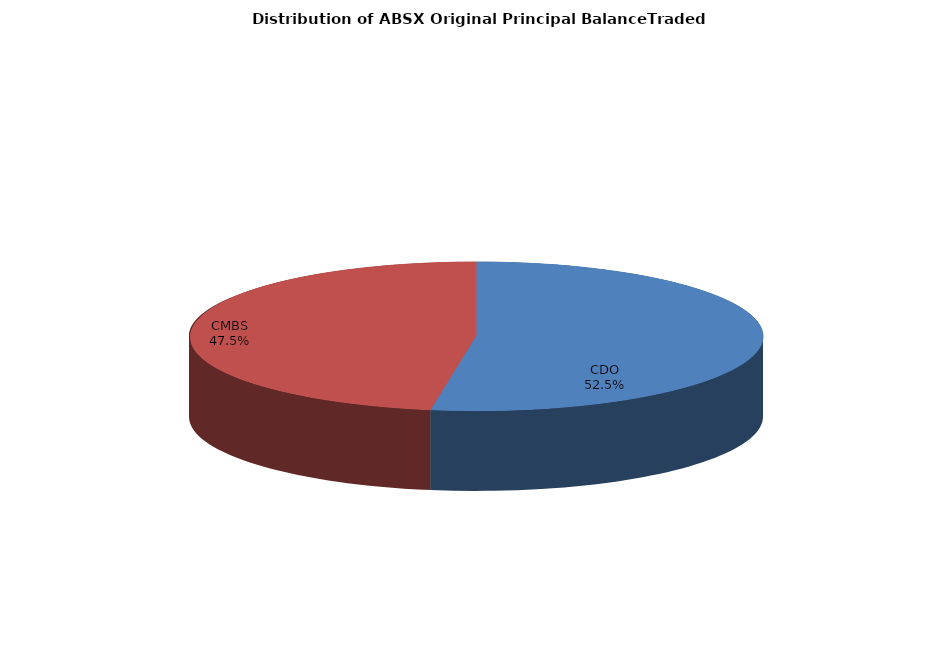
| Category | Series 0 |
|---|---|
| CDO | 1877385214.609 |
| CMBS | 1696836872.783 |